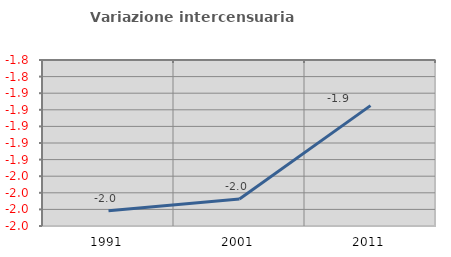
| Category | Variazione intercensuaria annua |
|---|---|
| 1991.0 | -2.001 |
| 2001.0 | -1.987 |
| 2011.0 | -1.875 |